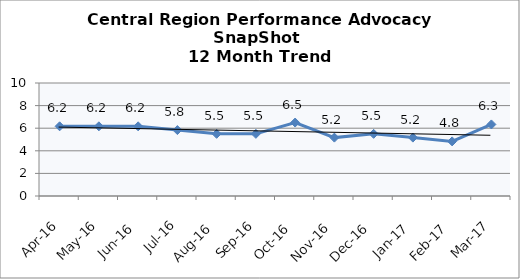
| Category | Central Region |
|---|---|
| Apr-16 | 6.167 |
| May-16 | 6.167 |
| Jun-16 | 6.167 |
| Jul-16 | 5.833 |
| Aug-16 | 5.5 |
| Sep-16 | 5.5 |
| Oct-16 | 6.5 |
| Nov-16 | 5.167 |
| Dec-16 | 5.5 |
| Jan-17 | 5.167 |
| Feb-17 | 4.833 |
| Mar-17 | 6.333 |